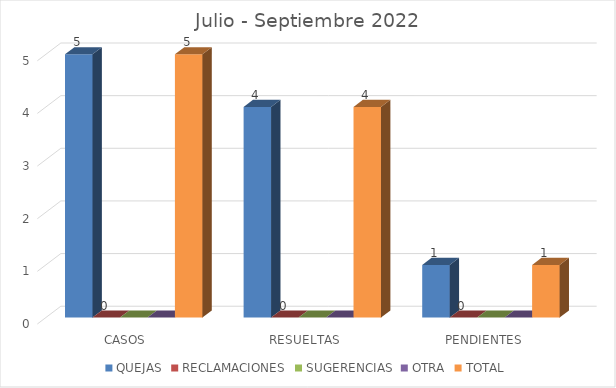
| Category | QUEJAS | RECLAMACIONES | SUGERENCIAS | OTRA | TOTAL |
|---|---|---|---|---|---|
| CASOS | 5 | 0 | 0 | 0 | 5 |
| RESUELTAS | 4 | 0 | 0 | 0 | 4 |
| PENDIENTES | 1 | 0 | 0 | 0 | 1 |